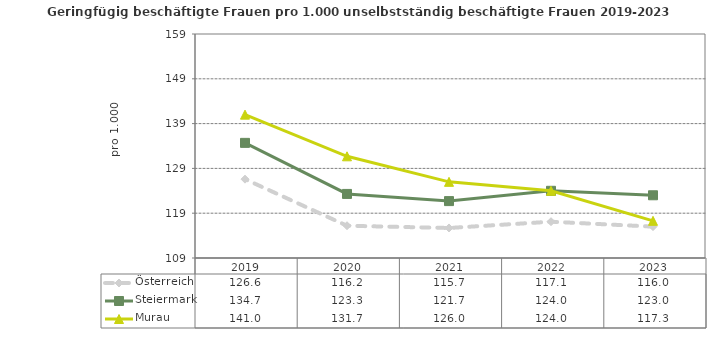
| Category | Österreich | Steiermark | Murau |
|---|---|---|---|
| 2023.0 | 116 | 123 | 117.3 |
| 2022.0 | 117.1 | 124 | 124 |
| 2021.0 | 115.7 | 121.7 | 126 |
| 2020.0 | 116.2 | 123.3 | 131.7 |
| 2019.0 | 126.6 | 134.7 | 141 |